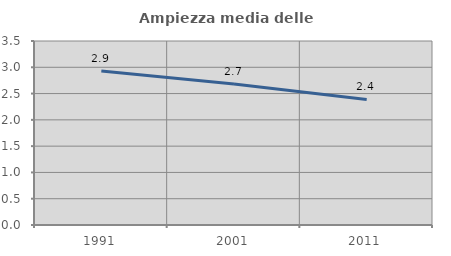
| Category | Ampiezza media delle famiglie |
|---|---|
| 1991.0 | 2.931 |
| 2001.0 | 2.684 |
| 2011.0 | 2.388 |